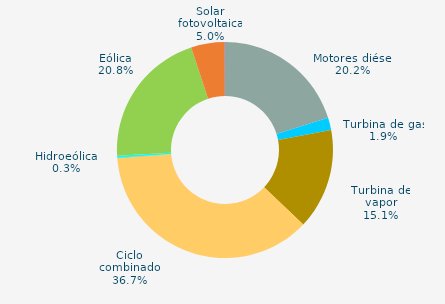
| Category | Series 0 |
|---|---|
| Motores diésel | 20.19 |
| Turbina de gas | 1.861 |
| Turbina de vapor | 15.053 |
| Ciclo combinado | 36.7 |
| Cogeneración | 0 |
| Hidráulica | 0.04 |
| Hidroeólica | 0.318 |
| Eólica | 20.772 |
| Solar fotovoltaica | 5.005 |
| Otras renovables | 0.061 |